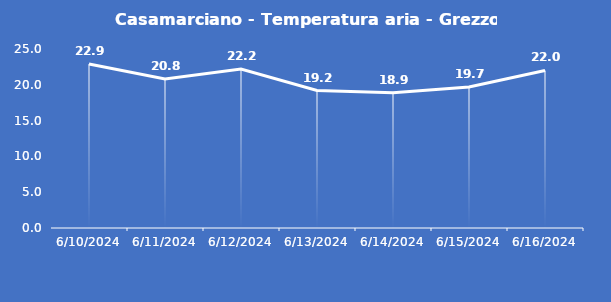
| Category | Casamarciano - Temperatura aria - Grezzo (°C) |
|---|---|
| 6/10/24 | 22.9 |
| 6/11/24 | 20.8 |
| 6/12/24 | 22.2 |
| 6/13/24 | 19.2 |
| 6/14/24 | 18.9 |
| 6/15/24 | 19.7 |
| 6/16/24 | 22 |